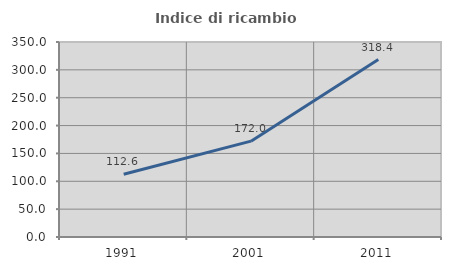
| Category | Indice di ricambio occupazionale  |
|---|---|
| 1991.0 | 112.601 |
| 2001.0 | 172.01 |
| 2011.0 | 318.44 |